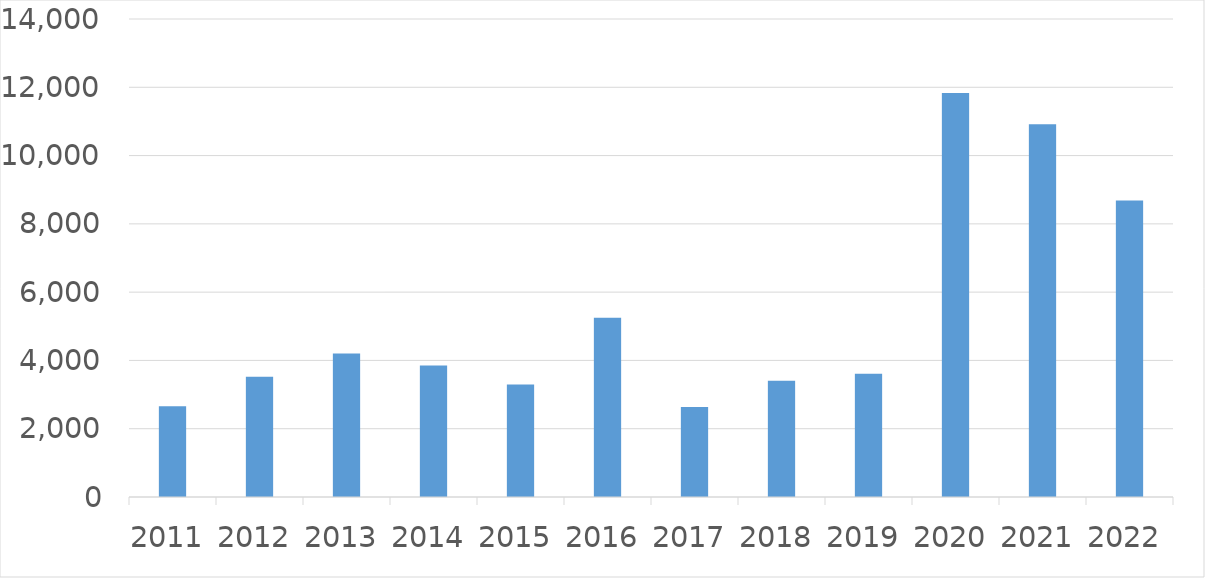
| Category | Series 0 |
|---|---|
| 2011 | 2656 |
| 2012 | 3524 |
| 2013 | 4200 |
| 2014 | 3849 |
| 2015 | 3294 |
| 2016 | 5249 |
| 2017 | 2636 |
| 2018 | 3406 |
| 2019 | 3611 |
| 2020 | 11835 |
| 2021 | 10919 |
| 2022 | 8682 |